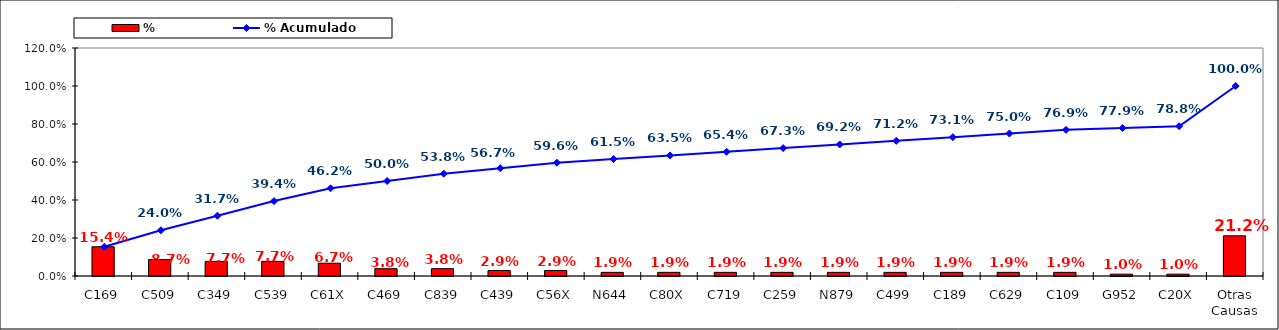
| Category | % |
|---|---|
| C169 | 0.154 |
| C509 | 0.087 |
| C349 | 0.077 |
| C539 | 0.077 |
| C61X | 0.067 |
| C469 | 0.038 |
| C839 | 0.038 |
| C439 | 0.029 |
| C56X | 0.029 |
| N644 | 0.019 |
| C80X | 0.019 |
| C719 | 0.019 |
| C259 | 0.019 |
| N879 | 0.019 |
| C499 | 0.019 |
| C189 | 0.019 |
| C629 | 0.019 |
| C109 | 0.019 |
| G952 | 0.01 |
| C20X | 0.01 |
| Otras Causas | 0.212 |